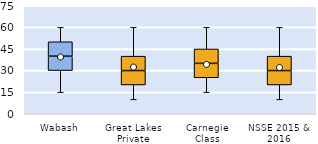
| Category | 25th | 50th | 75th |
|---|---|---|---|
| Wabash | 30 | 10 | 10 |
| Great Lakes Private | 20 | 10 | 10 |
| Carnegie Class | 25 | 10 | 10 |
| NSSE 2015 & 2016 | 20 | 10 | 10 |